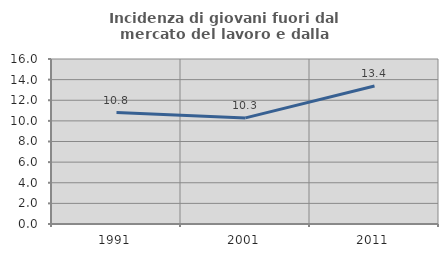
| Category | Incidenza di giovani fuori dal mercato del lavoro e dalla formazione  |
|---|---|
| 1991.0 | 10.81 |
| 2001.0 | 10.289 |
| 2011.0 | 13.385 |